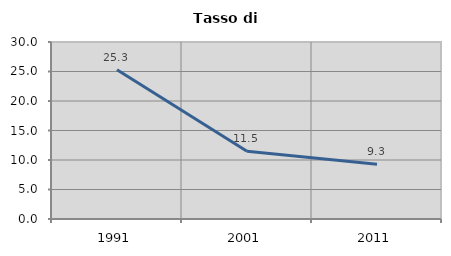
| Category | Tasso di disoccupazione   |
|---|---|
| 1991.0 | 25.301 |
| 2001.0 | 11.486 |
| 2011.0 | 9.292 |